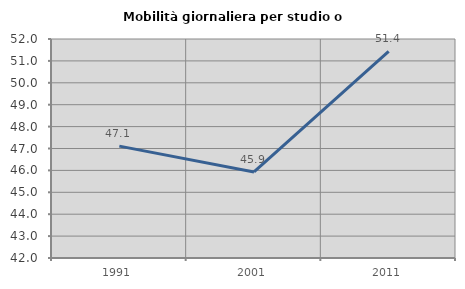
| Category | Mobilità giornaliera per studio o lavoro |
|---|---|
| 1991.0 | 47.108 |
| 2001.0 | 45.93 |
| 2011.0 | 51.438 |